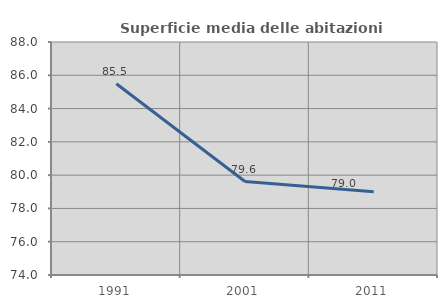
| Category | Superficie media delle abitazioni occupate |
|---|---|
| 1991.0 | 85.489 |
| 2001.0 | 79.617 |
| 2011.0 | 79 |